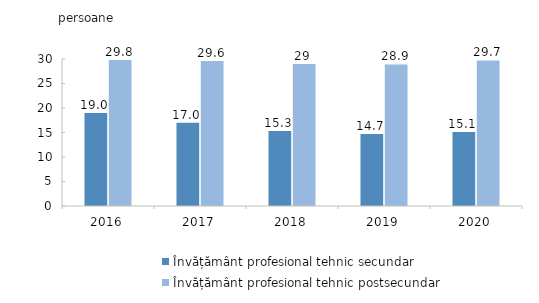
| Category | Învățământ profesional tehnic secundar | Învățământ profesional tehnic postsecundar |
|---|---|---|
| 2016.0 | 19 | 29.8 |
| 2017.0 | 17 | 29.6 |
| 2018.0 | 15.3 | 29 |
| 2019.0 | 14.7 | 28.9 |
| 2020.0 | 15.1 | 29.7 |